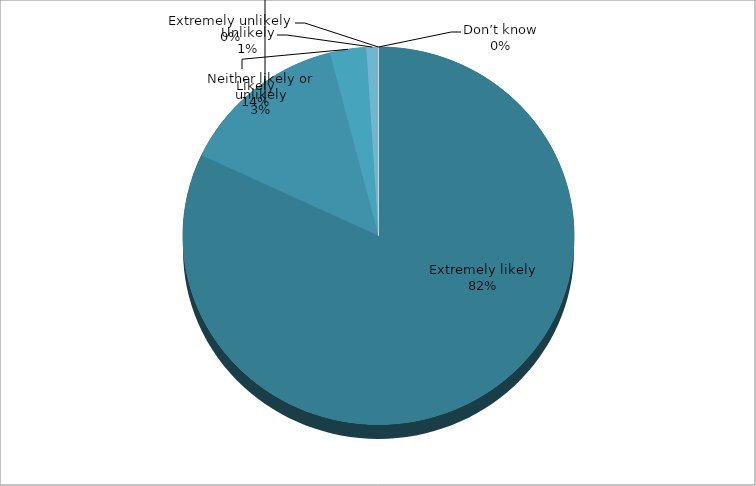
| Category | Series 0 |
|---|---|
| Extremely likely | 82 |
| Likely | 14 |
| Neither likely or unlikely | 3 |
| Unlikely | 1 |
| Extremely unlikely | 0 |
| Don’t know | 0 |